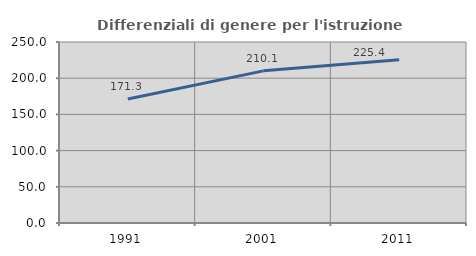
| Category | Differenziali di genere per l'istruzione superiore |
|---|---|
| 1991.0 | 171.294 |
| 2001.0 | 210.129 |
| 2011.0 | 225.367 |